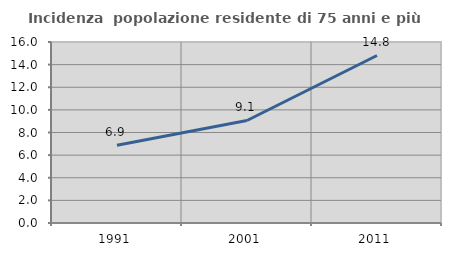
| Category | Incidenza  popolazione residente di 75 anni e più |
|---|---|
| 1991.0 | 6.869 |
| 2001.0 | 9.063 |
| 2011.0 | 14.809 |